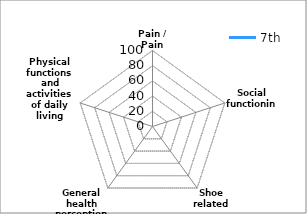
| Category | 7th |
|---|---|
| Pain / Pain related | 0 |
| Social functioning | 0 |
| Shoe related | 0 |
| General health perceptions | 0 |
| Physical functions and activities of daily living (ADL) | 0 |